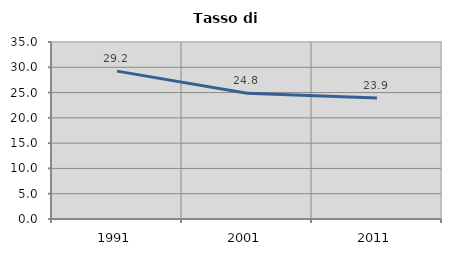
| Category | Tasso di disoccupazione   |
|---|---|
| 1991.0 | 29.24 |
| 2001.0 | 24.847 |
| 2011.0 | 23.905 |